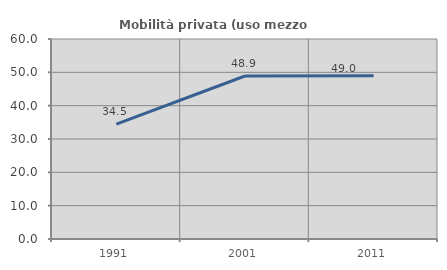
| Category | Mobilità privata (uso mezzo privato) |
|---|---|
| 1991.0 | 34.454 |
| 2001.0 | 48.901 |
| 2011.0 | 49.007 |